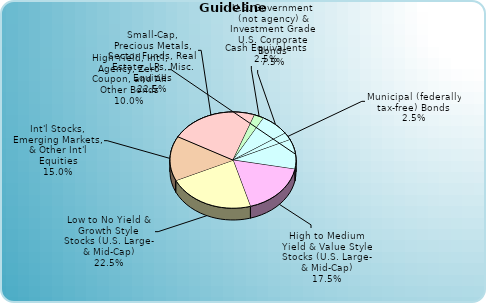
| Category | Series 0 |
|---|---|
| Cash Equivalents | 0.025 |
| U.S. Government (not agency) & Investment Grade U.S. Corporate Bonds | 0.075 |
| Municipal (federally tax-free) Bonds | 0.025 |
| High Yield, Int'l, Agency, Zero Coupon, and All Other Bonds | 0.1 |
| High to Medium Yield & Value Style Stocks (U.S. Large- & Mid-Cap) | 0.175 |
| Low to No Yield & Growth Style Stocks (U.S. Large- & Mid-Cap) | 0.225 |
| Int'l Stocks, Emerging Markets, & Other Int'l Equities | 0.15 |
| Small-Cap, Precious Metals, Sector Funds, Real Estate, LPs, Misc. Equities | 0.225 |